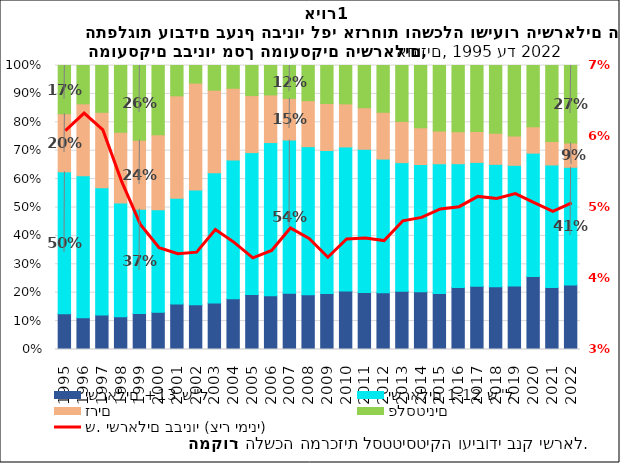
| Category | ישראלים +13 ש"ל | ישראלים 1-12 ש"ל | זרים | פלסטינים |
|---|---|---|---|---|
| 1995.0 | 0.126 | 0.499 | 0.205 | 0.17 |
| 1996.0 | 0.112 | 0.5 | 0.253 | 0.135 |
| 1997.0 | 0.122 | 0.447 | 0.266 | 0.165 |
| 1998.0 | 0.116 | 0.4 | 0.249 | 0.235 |
| 1999.0 | 0.127 | 0.367 | 0.243 | 0.263 |
| 2000.0 | 0.132 | 0.361 | 0.264 | 0.244 |
| 2001.0 | 0.161 | 0.372 | 0.361 | 0.107 |
| 2002.0 | 0.158 | 0.404 | 0.376 | 0.062 |
| 2003.0 | 0.164 | 0.459 | 0.29 | 0.087 |
| 2004.0 | 0.178 | 0.489 | 0.253 | 0.08 |
| 2005.0 | 0.194 | 0.5 | 0.201 | 0.106 |
| 2006.0 | 0.189 | 0.539 | 0.168 | 0.104 |
| 2007.0 | 0.198 | 0.54 | 0.147 | 0.116 |
| 2008.0 | 0.192 | 0.522 | 0.162 | 0.124 |
| 2009.0 | 0.197 | 0.504 | 0.165 | 0.134 |
| 2010.0 | 0.206 | 0.507 | 0.152 | 0.135 |
| 2011.0 | 0.2 | 0.505 | 0.146 | 0.149 |
| 2012.0 | 0.2 | 0.471 | 0.165 | 0.165 |
| 2013.0 | 0.206 | 0.452 | 0.145 | 0.197 |
| 2014.0 | 0.204 | 0.448 | 0.129 | 0.219 |
| 2015.0 | 0.198 | 0.456 | 0.115 | 0.231 |
| 2016.0 | 0.219 | 0.436 | 0.113 | 0.233 |
| 2017.0 | 0.222 | 0.436 | 0.109 | 0.232 |
| 2018.0 | 0.221 | 0.431 | 0.109 | 0.239 |
| 2019.0 | 0.223 | 0.425 | 0.103 | 0.249 |
| 2020.0 | 0.257 | 0.434 | 0.093 | 0.216 |
| 2021.0 | 0.218 | 0.432 | 0.083 | 0.267 |
| 2022.0 | 0.227 | 0.415 | 0.086 | 0.273 |